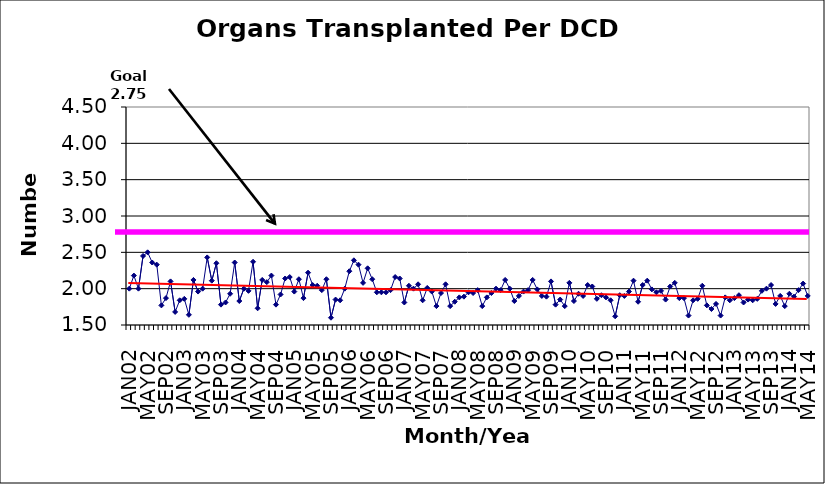
| Category | Series 0 |
|---|---|
| JAN02 | 2 |
| FEB02 | 2.18 |
| MAR02 | 2 |
| APR02 | 2.45 |
| MAY02 | 2.5 |
| JUN02 | 2.36 |
| JUL02 | 2.33 |
| AUG02 | 1.77 |
| SEP02 | 1.87 |
| OCT02 | 2.1 |
| NOV02 | 1.68 |
| DEC02 | 1.84 |
| JAN03 | 1.86 |
| FEB03 | 1.64 |
| MAR03 | 2.12 |
| APR03 | 1.96 |
| MAY03 | 2 |
| JUN03 | 2.43 |
| JUL03 | 2.11 |
| AUG03 | 2.35 |
| SEP03 | 1.78 |
| OCT03 | 1.81 |
| NOV03 | 1.93 |
| DEC03 | 2.36 |
| JAN04 | 1.83 |
| FEB04 | 2 |
| MAR04 | 1.97 |
| APR04 | 2.37 |
| MAY04 | 1.73 |
| JUN04 | 2.12 |
| JUL04 | 2.09 |
| AUG04 | 2.18 |
| SEP04 | 1.78 |
| OCT04 | 1.92 |
| NOV04 | 2.14 |
| DEC04 | 2.16 |
| JAN05 | 1.96 |
| FEB05 | 2.13 |
| MAR05 | 1.87 |
| APR05 | 2.22 |
| MAY05 | 2.05 |
| JUN05 | 2.04 |
| JUL05 | 1.98 |
| AUG05 | 2.13 |
| SEP05 | 1.6 |
| OCT05 | 1.85 |
| NOV05 | 1.84 |
| DEC05 | 2 |
| JAN06 | 2.24 |
| FEB06 | 2.39 |
| MAR06 | 2.33 |
| APR06 | 2.08 |
| MAY06 | 2.28 |
| JUN06 | 2.13 |
| JUL06 | 1.95 |
| AUG06 | 1.95 |
| SEP06 | 1.95 |
| OCT06 | 1.98 |
| NOV06 | 2.16 |
| DEC06 | 2.14 |
| JAN07 | 1.81 |
| FEB07 | 2.04 |
| MAR07 | 2 |
| APR07 | 2.06 |
| MAY07 | 1.84 |
| JUN07 | 2.01 |
| JUL07 | 1.96 |
| AUG07 | 1.76 |
| SEP07 | 1.94 |
| OCT07 | 2.06 |
| NOV07 | 1.76 |
| DEC07 | 1.82 |
| JAN08 | 1.88 |
| FEB08 | 1.89 |
| MAR08 | 1.95 |
| APR08 | 1.94 |
| MAY08 | 1.98 |
| JUN08 | 1.76 |
| JUL08 | 1.88 |
| AUG08 | 1.94 |
| SEP08 | 2 |
| OCT08 | 1.98 |
| NOV08 | 2.12 |
| DEC08 | 2 |
| JAN09 | 1.83 |
| FEB09 | 1.9 |
| MAR09 | 1.96 |
| APR09 | 1.98 |
| MAY09 | 2.12 |
| JUN09 | 1.99 |
| JUL09 | 1.9 |
| AUG09 | 1.89 |
| SEP09 | 2.1 |
| OCT09 | 1.78 |
| NOV09 | 1.85 |
| DEC09 | 1.76 |
| JAN10 | 2.08 |
| FEB10 | 1.83 |
| MAR10 | 1.93 |
| APR10 | 1.9 |
| MAY10 | 2.05 |
| JUN10 | 2.03 |
| JUL10 | 1.86 |
| AUG10 | 1.91 |
| SEP10 | 1.88 |
| OCT10 | 1.84 |
| NOV10 | 1.62 |
| DEC10 | 1.91 |
| JAN11 | 1.9 |
| FEB11 | 1.96 |
| MAR11 | 2.11 |
| APR11 | 1.82 |
| MAY11 | 2.05 |
| JUN11 | 2.11 |
| JUL11 | 1.99 |
| AUG11 | 1.95 |
| SEP11 | 1.97 |
| OCT11 | 1.85 |
| NOV11 | 2.03 |
| DEC11 | 2.08 |
| JAN12 | 1.87 |
| FEB12 | 1.87 |
| MAR12 | 1.63 |
| APR12 | 1.84 |
| MAY12 | 1.86 |
| JUN12 | 2.04 |
| JUL12 | 1.77 |
| AUG12 | 1.72 |
| SEP12 | 1.79 |
| OCT12 | 1.63 |
| NOV12 | 1.88 |
| DEC12 | 1.84 |
| JAN13 | 1.87 |
| FEB13 | 1.91 |
| MAR13 | 1.81 |
| APR13 | 1.85 |
| MAY13 | 1.84 |
| JUN13 | 1.86 |
| JUL13 | 1.97 |
| AUG13 | 2 |
| SEP13 | 2.05 |
| OCT13 | 1.79 |
| NOV13 | 1.9 |
| DEC13 | 1.76 |
| JAN14 | 1.93 |
| FEB14 | 1.89 |
| MAR14 | 1.98 |
| APR14 | 2.07 |
| MAY14 | 1.9 |